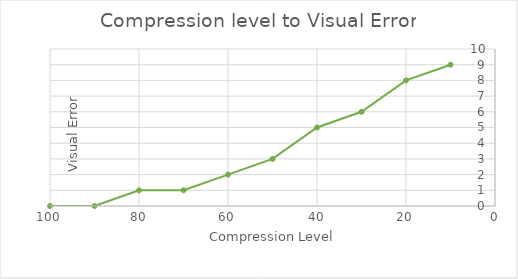
| Category | Series 0 |
|---|---|
| 100.0 | 0 |
| 90.0 | 0 |
| 80.0 | 1 |
| 70.0 | 1 |
| 60.0 | 2 |
| 50.0 | 3 |
| 40.0 | 5 |
| 30.0 | 6 |
| 20.0 | 8 |
| 10.0 | 9 |